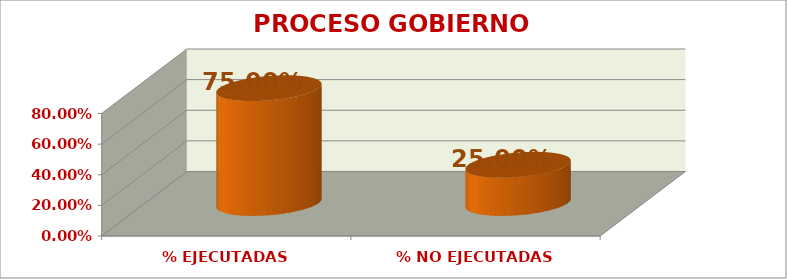
| Category | PROCESO GOBIERNO ESCOLAR |
|---|---|
| % EJECUTADAS | 0.75 |
| % NO EJECUTADAS | 0.25 |